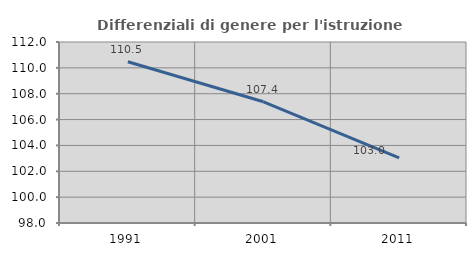
| Category | Differenziali di genere per l'istruzione superiore |
|---|---|
| 1991.0 | 110.47 |
| 2001.0 | 107.377 |
| 2011.0 | 103.038 |